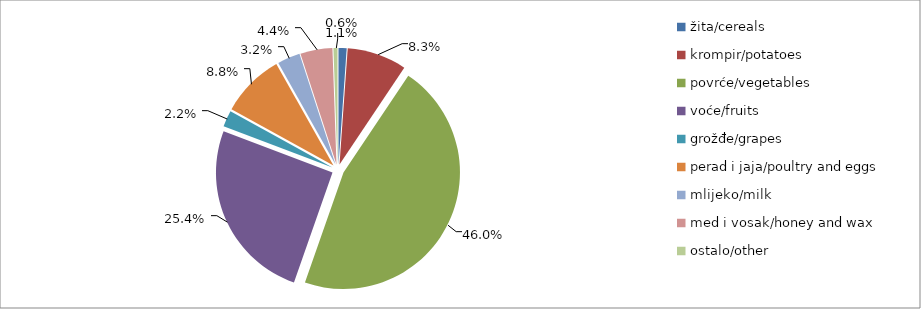
| Category | Series 0 |
|---|---|
| žita/cereals | 25010 |
| krompir/potatoes | 183555 |
| povrće/vegetables | 1022169 |
| voće/fruits | 564760.5 |
| grožđe/grapes | 49781 |
| perad i jaja/poultry and eggs | 196048 |
| mlijeko/milk | 70200 |
| med i vosak/honey and wax | 98895 |
| ostalo/other | 12420 |